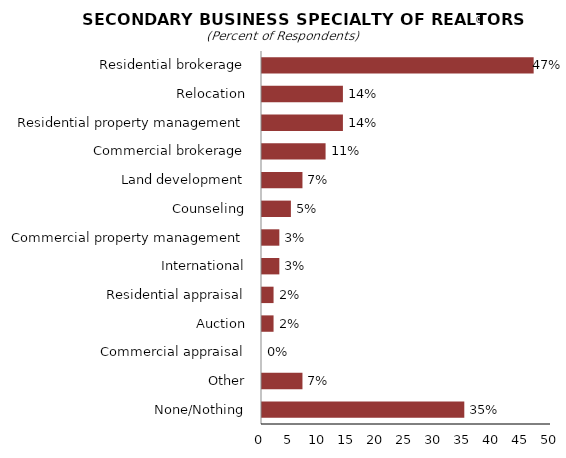
| Category | Series 0 |
|---|---|
| Residential brokerage | 47 |
| Relocation | 14 |
| Residential property management | 14 |
| Commercial brokerage | 11 |
| Land development | 7 |
| Counseling | 5 |
| Commercial property management | 3 |
| International | 3 |
| Residential appraisal | 2 |
| Auction | 2 |
| Commercial appraisal | 0 |
| Other | 7 |
| None/Nothing | 35 |